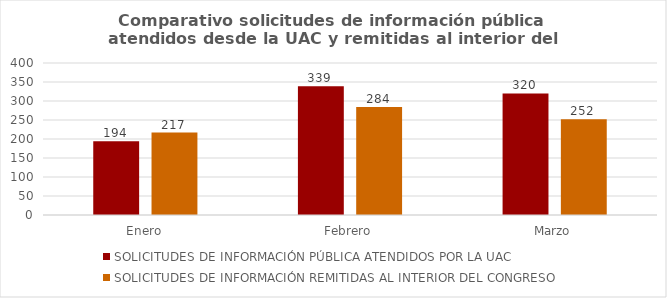
| Category | SOLICITUDES DE INFORMACIÓN PÚBLICA ATENDIDOS POR LA UAC | SOLICITUDES DE INFORMACIÓN REMITIDAS AL INTERIOR DEL CONGRESO  |
|---|---|---|
| Enero | 194 | 217 |
| Febrero | 339 | 284 |
| Marzo | 320 | 252 |